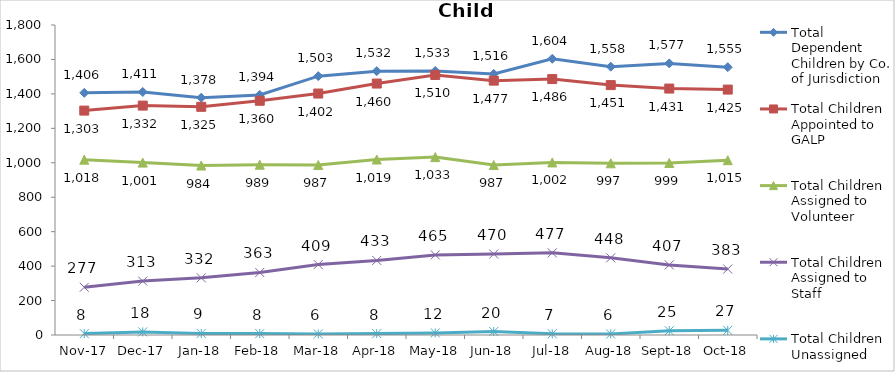
| Category | Total Dependent Children by Co. of Jurisdiction | Total Children Appointed to GALP | Total Children Assigned to Volunteer | Total Children Assigned to Staff | Total Children Unassigned |
|---|---|---|---|---|---|
| 2017-11-01 | 1406 | 1303 | 1018 | 277 | 8 |
| 2017-12-01 | 1411 | 1332 | 1001 | 313 | 18 |
| 2018-01-01 | 1378 | 1325 | 984 | 332 | 9 |
| 2018-02-01 | 1394 | 1360 | 989 | 363 | 8 |
| 2018-03-01 | 1503 | 1402 | 987 | 409 | 6 |
| 2018-04-01 | 1532 | 1460 | 1019 | 433 | 8 |
| 2018-05-01 | 1533 | 1510 | 1033 | 465 | 12 |
| 2018-06-01 | 1516 | 1477 | 987 | 470 | 20 |
| 2018-07-01 | 1604 | 1486 | 1002 | 477 | 7 |
| 2018-08-01 | 1558 | 1451 | 997 | 448 | 6 |
| 2018-09-01 | 1577 | 1431 | 999 | 407 | 25 |
| 2018-10-01 | 1555 | 1425 | 1015 | 383 | 27 |